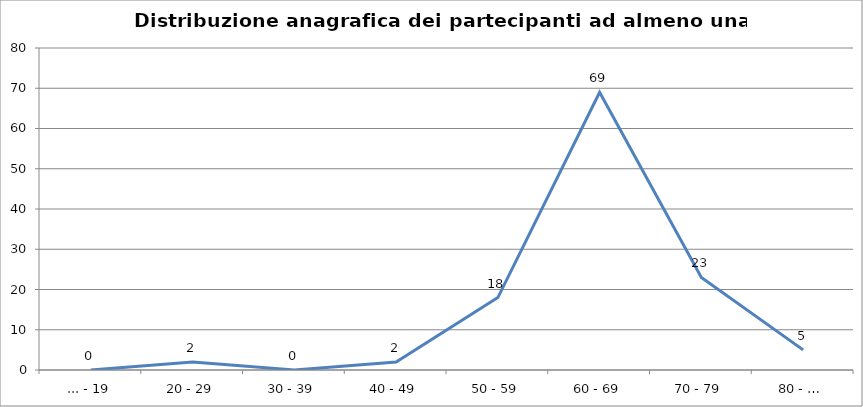
| Category | Nr. Tesserati |
|---|---|
| ... - 19 | 0 |
| 20 - 29 | 2 |
| 30 - 39 | 0 |
| 40 - 49 | 2 |
| 50 - 59 | 18 |
| 60 - 69 | 69 |
| 70 - 79 | 23 |
| 80 - … | 5 |